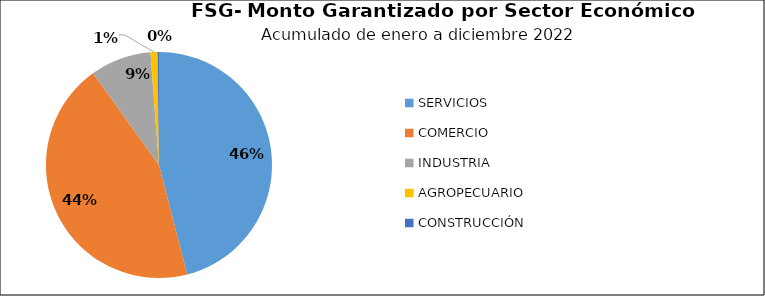
| Category | Monto | Créditos |
|---|---|---|
| SERVICIOS | 32.686 | 3813 |
| COMERCIO | 31.342 | 7043 |
| INDUSTRIA | 6.198 | 1412 |
| AGROPECUARIO | 0.715 | 45 |
| CONSTRUCCIÓN | 0.146 | 14 |